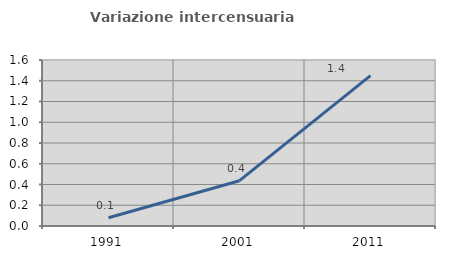
| Category | Variazione intercensuaria annua |
|---|---|
| 1991.0 | 0.08 |
| 2001.0 | 0.437 |
| 2011.0 | 1.45 |